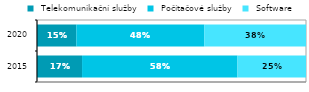
| Category |  Telekomunikační služby |  Počítačové služby |  Software |
|---|---|---|---|
|  2015 | 0.167 | 0.578 | 0.255 |
|  2020 | 0.146 | 0.475 | 0.378 |